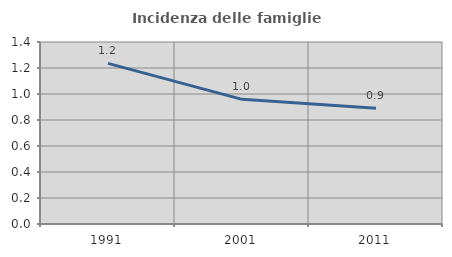
| Category | Incidenza delle famiglie numerose |
|---|---|
| 1991.0 | 1.236 |
| 2001.0 | 0.959 |
| 2011.0 | 0.89 |